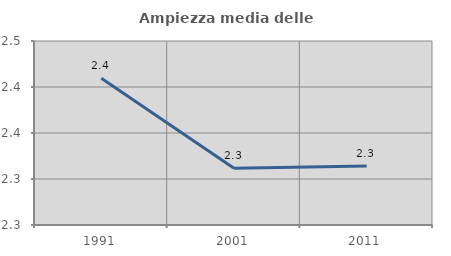
| Category | Ampiezza media delle famiglie |
|---|---|
| 1991.0 | 2.409 |
| 2001.0 | 2.312 |
| 2011.0 | 2.314 |